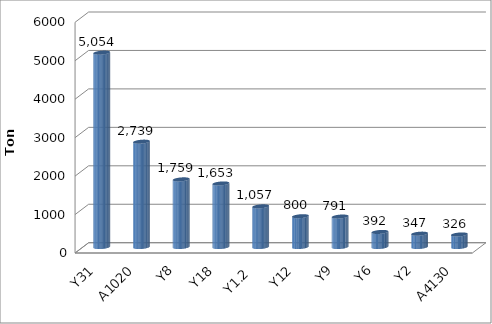
| Category | Series 0 |
|---|---|
| Y31 | 5054.383 |
| A1020 | 2739.184 |
| Y8 | 1758.62 |
| Y18 | 1652.529 |
| Y1.2 | 1056.655 |
| Y12 | 800.39 |
| Y9 | 791.187 |
| Y6 | 391.683 |
| Y2 | 346.559 |
| A4130 | 325.755 |